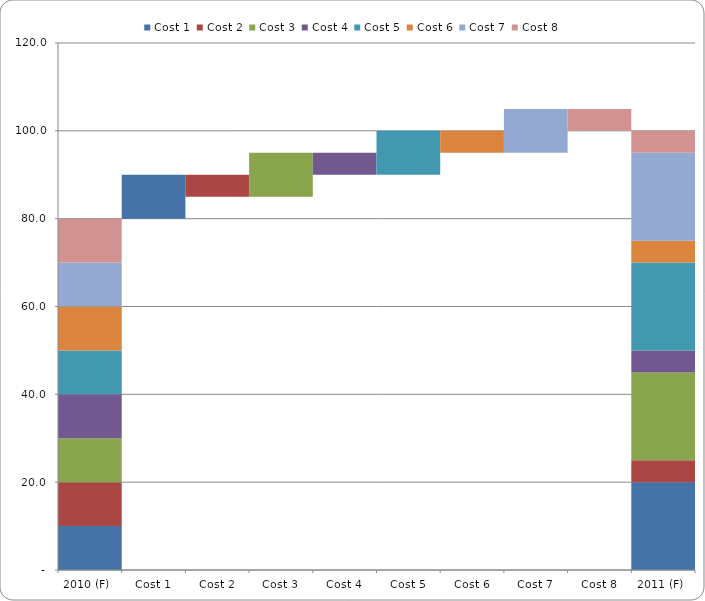
| Category | Clear | Cost 1 | Cost 2 | Cost 3 | Cost 4 | Cost 5 | Cost 6 | Cost 7 | Cost 8 |
|---|---|---|---|---|---|---|---|---|---|
| 2010 (F)  | 0 | 10 | 10 | 10 | 10 | 10 | 10 | 10 | 10 |
| Cost 1 | 80 | 10 | 0 | 0 | 0 | 0 | 0 | 0 | 0 |
| Cost 2 | 85 | 0 | 5 | 0 | 0 | 0 | 0 | 0 | 0 |
| Cost 3 | 85 | 0 | 0 | 10 | 0 | 0 | 0 | 0 | 0 |
| Cost 4 | 90 | 0 | 0 | 0 | 5 | 0 | 0 | 0 | 0 |
| Cost 5 | 90 | 0 | 0 | 0 | 0 | 10 | 0 | 0 | 0 |
| Cost 6 | 95 | 0 | 0 | 0 | 0 | 0 | 5 | 0 | 0 |
| Cost 7 | 95 | 0 | 0 | 0 | 0 | 0 | 0 | 10 | 0 |
| Cost 8 | 100 | 0 | 0 | 0 | 0 | 0 | 0 | 0 | 5 |
| 2011 (F)  | 0 | 20 | 5 | 20 | 5 | 20 | 5 | 20 | 5 |